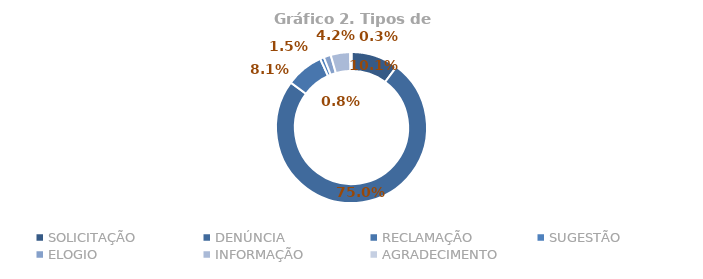
| Category | Total |
|---|---|
| SOLICITAÇÃO | 0.101 |
| DENÚNCIA | 0.75 |
| RECLAMAÇÃO | 0.081 |
| SUGESTÃO | 0.008 |
| ELOGIO | 0.015 |
| INFORMAÇÃO | 0.042 |
| AGRADECIMENTO | 0.003 |